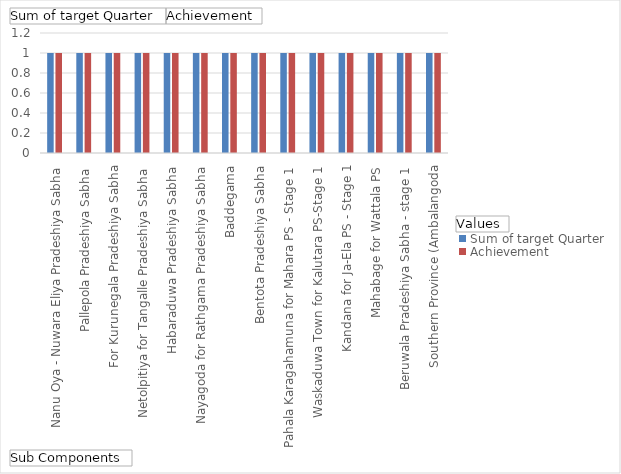
| Category | Sum of target Quarter | Achievement |
|---|---|---|
| Nanu Oya - Nuwara Eliya Pradeshiya Sabha | 1 | 1 |
|  Pallepola Pradeshiya Sabha | 1 | 1 |
| For Kurunegala Pradeshiya Sabha | 1 | 1 |
|  Netolpitiya for Tangalle Pradeshiya Sabha | 1 | 1 |
|  Habaraduwa Pradeshiya Sabha | 1 | 1 |
| Nayagoda for Rathgama Pradeshiya Sabha | 1 | 1 |
|  Baddegama | 1 | 1 |
|  Bentota Pradeshiya Sabha | 1 | 1 |
| Pahala Karagahamuna for Mahara PS - Stage 1 | 1 | 1 |
|  Waskaduwa Town for Kalutara PS-Stage 1 | 1 | 1 |
|  Kandana for Ja-Ela PS - Stage 1 | 1 | 1 |
| Mahabage for Wattala PS | 1 | 1 |
|  Beruwala Pradeshiya Sabha - stage 1 | 1 | 1 |
|  Southern Province (Ambalangoda, Baddegama, Habaraduwa, Ratgama, Tangalla and Matara PSs | 1 | 1 |